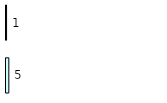
| Category | Series 0 | Series 1 |
|---|---|---|
| 0 | 5 | 1 |